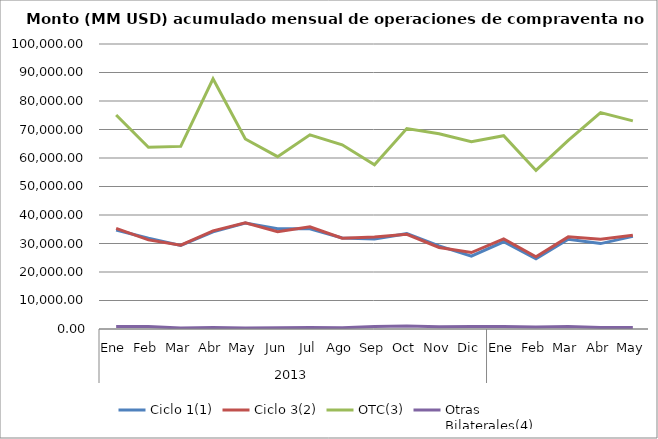
| Category | Ciclo 1(1) | Ciclo 3(2) | OTC(3) | Otras
Bilaterales(4) |
|---|---|---|---|---|
| 0 | 34736.674 | 35336.778 | 75100.994 | 862.558 |
| 1 | 31837.301 | 31276.084 | 63735.014 | 835.426 |
| 2 | 29308.645 | 29417.861 | 64070.642 | 371.583 |
| 3 | 34083.554 | 34428.23 | 87796.406 | 540.738 |
| 4 | 37163.38 | 37242.543 | 66687.424 | 368.797 |
| 5 | 35163.266 | 34165.361 | 60467.987 | 473.52 |
| 6 | 35197.057 | 35828.881 | 68121.887 | 537.978 |
| 7 | 31913.776 | 31846.832 | 64630.867 | 477.656 |
| 8 | 31601.855 | 32260.646 | 57599.123 | 864.94 |
| 9 | 33455.872 | 33201.092 | 70316.044 | 1074.052 |
| 10 | 29141.89 | 28620.849 | 68482.193 | 758.559 |
| 11 | 25532.796 | 26816.016 | 65678.317 | 842.072 |
| 12 | 30609.998 | 31608.391 | 67807.808 | 838.473 |
| 13 | 24661.445 | 25355.64 | 55646.165 | 717.558 |
| 14 | 31490.456 | 32327.003 | 66188.016 | 905.778 |
| 15 | 29968.466 | 31511.409 | 75953.393 | 552.114 |
| 16 | 32511.8 | 32893.552 | 73041.006 | 512.251 |